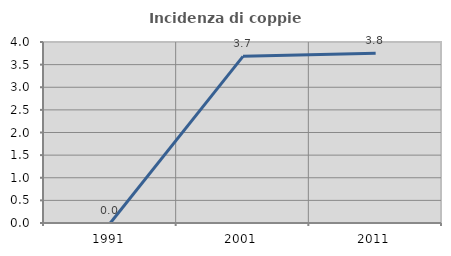
| Category | Incidenza di coppie miste |
|---|---|
| 1991.0 | 0 |
| 2001.0 | 3.683 |
| 2011.0 | 3.75 |